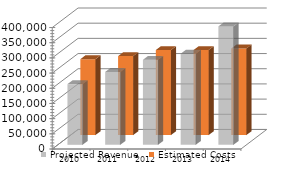
| Category | Projected Revenue | Estimated Costs |
|---|---|---|
| 2010.0 | 200000 | 250000 |
| 2011.0 | 240000 | 260000 |
| 2012.0 | 280000 | 280000 |
| 2013.0 | 300000 | 280000 |
| 2014.0 | 390000 | 285000 |